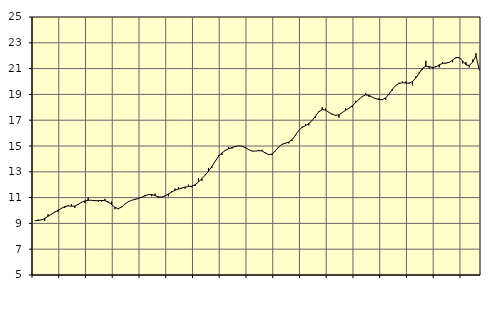
| Category | Piggar | Finansiell verksamhet, företagstjänster, SNI 64-82 |
|---|---|---|
| nan | 9.2 | 9.2 |
| 87.0 | 9.3 | 9.23 |
| 87.0 | 9.3 | 9.28 |
| 87.0 | 9.2 | 9.37 |
| nan | 9.7 | 9.55 |
| 88.0 | 9.7 | 9.72 |
| 88.0 | 9.9 | 9.87 |
| 88.0 | 9.9 | 10.01 |
| nan | 10.2 | 10.16 |
| 89.0 | 10.2 | 10.3 |
| 89.0 | 10.4 | 10.36 |
| 89.0 | 10.5 | 10.33 |
| nan | 10.2 | 10.35 |
| 90.0 | 10.5 | 10.47 |
| 90.0 | 10.6 | 10.63 |
| 90.0 | 10.6 | 10.74 |
| nan | 11 | 10.79 |
| 91.0 | 10.8 | 10.79 |
| 91.0 | 10.8 | 10.76 |
| 91.0 | 10.7 | 10.76 |
| nan | 10.7 | 10.78 |
| 92.0 | 10.9 | 10.76 |
| 92.0 | 10.6 | 10.67 |
| 92.0 | 10.7 | 10.47 |
| nan | 10.1 | 10.24 |
| 93.0 | 10.1 | 10.15 |
| 93.0 | 10.3 | 10.26 |
| 93.0 | 10.5 | 10.5 |
| nan | 10.7 | 10.68 |
| 94.0 | 10.8 | 10.79 |
| 94.0 | 10.9 | 10.86 |
| 94.0 | 10.9 | 10.93 |
| nan | 11 | 11.03 |
| 95.0 | 11.1 | 11.15 |
| 95.0 | 11.2 | 11.23 |
| 95.0 | 11.1 | 11.24 |
| nan | 11.3 | 11.16 |
| 96.0 | 11 | 11.06 |
| 96.0 | 11 | 11.04 |
| 96.0 | 11.2 | 11.13 |
| nan | 11.1 | 11.28 |
| 97.0 | 11.5 | 11.43 |
| 97.0 | 11.7 | 11.57 |
| 97.0 | 11.8 | 11.66 |
| nan | 11.7 | 11.74 |
| 98.0 | 11.7 | 11.82 |
| 98.0 | 12 | 11.85 |
| 98.0 | 11.8 | 11.88 |
| nan | 11.9 | 12 |
| 99.0 | 12.5 | 12.21 |
| 99.0 | 12.3 | 12.47 |
| 99.0 | 12.8 | 12.74 |
| nan | 13.3 | 13.05 |
| 0.0 | 13.3 | 13.41 |
| 0.0 | 13.8 | 13.82 |
| 0.0 | 14.3 | 14.2 |
| nan | 14.3 | 14.47 |
| 1.0 | 14.7 | 14.65 |
| 1.0 | 14.9 | 14.78 |
| 1.0 | 14.8 | 14.88 |
| nan | 15 | 14.96 |
| 2.0 | 15 | 15.01 |
| 2.0 | 15 | 14.99 |
| 2.0 | 14.9 | 14.87 |
| nan | 14.7 | 14.72 |
| 3.0 | 14.6 | 14.61 |
| 3.0 | 14.6 | 14.6 |
| 3.0 | 14.7 | 14.64 |
| nan | 14.7 | 14.62 |
| 4.0 | 14.5 | 14.46 |
| 4.0 | 14.3 | 14.33 |
| 4.0 | 14.3 | 14.37 |
| nan | 14.6 | 14.63 |
| 5.0 | 14.9 | 14.93 |
| 5.0 | 15.1 | 15.13 |
| 5.0 | 15.2 | 15.22 |
| nan | 15.2 | 15.3 |
| 6.0 | 15.4 | 15.49 |
| 6.0 | 15.8 | 15.84 |
| 6.0 | 16.2 | 16.21 |
| nan | 16.5 | 16.44 |
| 7.0 | 16.7 | 16.58 |
| 7.0 | 16.6 | 16.74 |
| 7.0 | 17 | 16.98 |
| nan | 17.2 | 17.32 |
| 8.0 | 17.7 | 17.65 |
| 8.0 | 18 | 17.83 |
| 8.0 | 17.9 | 17.78 |
| nan | 17.6 | 17.61 |
| 9.0 | 17.5 | 17.46 |
| 9.0 | 17.4 | 17.37 |
| 9.0 | 17.2 | 17.42 |
| nan | 17.6 | 17.59 |
| 10.0 | 17.9 | 17.77 |
| 10.0 | 17.9 | 17.93 |
| 10.0 | 18 | 18.12 |
| nan | 18.5 | 18.36 |
| 11.0 | 18.6 | 18.62 |
| 11.0 | 18.8 | 18.84 |
| 11.0 | 19.1 | 18.96 |
| nan | 18.8 | 18.93 |
| 12.0 | 18.8 | 18.78 |
| 12.0 | 18.7 | 18.67 |
| 12.0 | 18.7 | 18.6 |
| nan | 18.6 | 18.59 |
| 13.0 | 18.6 | 18.73 |
| 13.0 | 19 | 19.03 |
| 13.0 | 19.3 | 19.4 |
| nan | 19.7 | 19.7 |
| 14.0 | 19.9 | 19.85 |
| 14.0 | 20 | 19.91 |
| 14.0 | 20 | 19.88 |
| nan | 19.9 | 19.87 |
| 15.0 | 19.7 | 20 |
| 15.0 | 20.4 | 20.27 |
| 15.0 | 20.7 | 20.64 |
| nan | 20.9 | 21.02 |
| 16.0 | 21.6 | 21.18 |
| 16.0 | 21 | 21.16 |
| 16.0 | 21 | 21.08 |
| nan | 21.2 | 21.13 |
| 17.0 | 21.1 | 21.29 |
| 17.0 | 21.5 | 21.4 |
| 17.0 | 21.4 | 21.43 |
| nan | 21.5 | 21.48 |
| 18.0 | 21.5 | 21.66 |
| 18.0 | 21.8 | 21.86 |
| 18.0 | 21.8 | 21.85 |
| nan | 21.4 | 21.59 |
| 19.0 | 21.5 | 21.29 |
| 19.0 | 21.1 | 21.24 |
| 19.0 | 21.7 | 21.5 |
| nan | 22.2 | 22 |
| 20.0 | 20.9 | 20.88 |